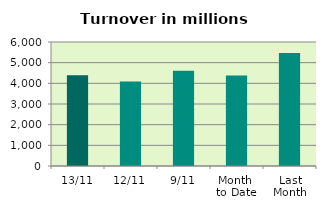
| Category | Series 0 |
|---|---|
| 13/11 | 4392.32 |
| 12/11 | 4085.004 |
| 9/11 | 4608.402 |
| Month 
to Date | 4379.921 |
| Last
Month | 5472.473 |